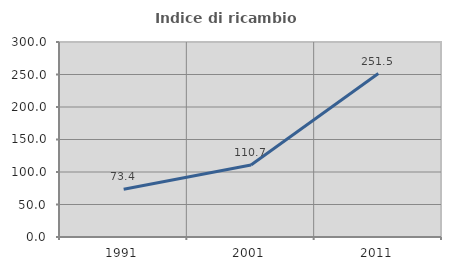
| Category | Indice di ricambio occupazionale  |
|---|---|
| 1991.0 | 73.356 |
| 2001.0 | 110.734 |
| 2011.0 | 251.481 |